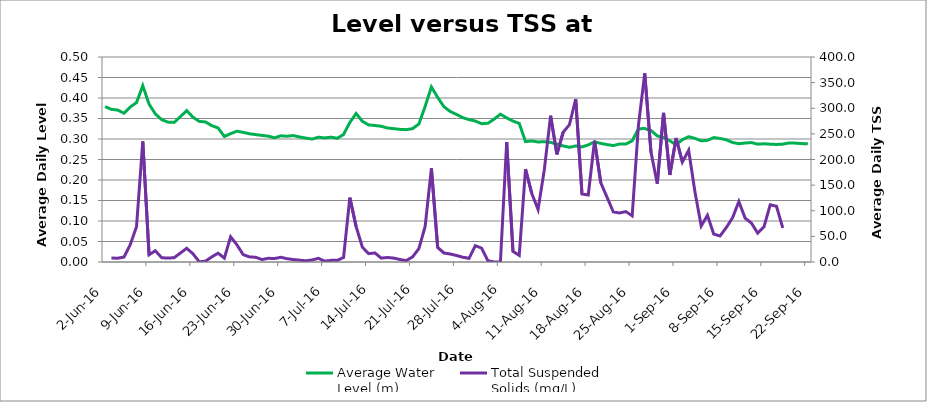
| Category | Average Water 
Level (m) |
|---|---|
| 2016-06-02 | 0.379 |
| 2016-06-03 | 0.372 |
| 2016-06-04 | 0.371 |
| 2016-06-05 | 0.363 |
| 2016-06-06 | 0.378 |
| 2016-06-07 | 0.389 |
| 2016-06-08 | 0.43 |
| 2016-06-09 | 0.385 |
| 2016-06-10 | 0.361 |
| 2016-06-11 | 0.347 |
| 2016-06-12 | 0.341 |
| 2016-06-13 | 0.34 |
| 2016-06-14 | 0.355 |
| 2016-06-15 | 0.369 |
| 2016-06-16 | 0.353 |
| 2016-06-17 | 0.343 |
| 2016-06-18 | 0.342 |
| 2016-06-19 | 0.333 |
| 2016-06-20 | 0.327 |
| 2016-06-21 | 0.306 |
| 2016-06-22 | 0.313 |
| 2016-06-23 | 0.319 |
| 2016-06-24 | 0.316 |
| 2016-06-25 | 0.313 |
| 2016-06-26 | 0.311 |
| 2016-06-27 | 0.309 |
| 2016-06-28 | 0.307 |
| 2016-06-29 | 0.303 |
| 2016-06-30 | 0.308 |
| 2016-07-01 | 0.307 |
| 2016-07-02 | 0.308 |
| 2016-07-03 | 0.305 |
| 2016-07-04 | 0.302 |
| 2016-07-05 | 0.3 |
| 2016-07-06 | 0.304 |
| 2016-07-07 | 0.303 |
| 2016-07-08 | 0.304 |
| 2016-07-09 | 0.302 |
| 2016-07-10 | 0.311 |
| 2016-07-11 | 0.34 |
| 2016-07-12 | 0.362 |
| 2016-07-13 | 0.343 |
| 2016-07-14 | 0.334 |
| 2016-07-15 | 0.333 |
| 2016-07-16 | 0.331 |
| 2016-07-17 | 0.327 |
| 2016-07-18 | 0.325 |
| 2016-07-19 | 0.323 |
| 2016-07-20 | 0.323 |
| 2016-07-21 | 0.325 |
| 2016-07-22 | 0.337 |
| 2016-07-23 | 0.379 |
| 2016-07-24 | 0.427 |
| 2016-07-25 | 0.401 |
| 2016-07-26 | 0.379 |
| 2016-07-27 | 0.367 |
| 2016-07-28 | 0.36 |
| 2016-07-29 | 0.352 |
| 2016-07-30 | 0.347 |
| 2016-07-31 | 0.344 |
| 2016-08-01 | 0.337 |
| 2016-08-02 | 0.338 |
| 2016-08-03 | 0.349 |
| 2016-08-04 | 0.361 |
| 2016-08-05 | 0.352 |
| 2016-08-06 | 0.344 |
| 2016-08-07 | 0.338 |
| 2016-08-08 | 0.294 |
| 2016-08-09 | 0.295 |
| 2016-08-10 | 0.293 |
| 2016-08-11 | 0.293 |
| 2016-08-12 | 0.292 |
| 2016-08-13 | 0.287 |
| 2016-08-14 | 0.283 |
| 2016-08-15 | 0.28 |
| 2016-08-16 | 0.283 |
| 2016-08-17 | 0.281 |
| 2016-08-18 | 0.286 |
| 2016-08-19 | 0.293 |
| 2016-08-20 | 0.289 |
| 2016-08-21 | 0.286 |
| 2016-08-22 | 0.284 |
| 2016-08-23 | 0.288 |
| 2016-08-24 | 0.288 |
| 2016-08-25 | 0.295 |
| 2016-08-26 | 0.325 |
| 2016-08-27 | 0.325 |
| 2016-08-28 | 0.321 |
| 2016-08-29 | 0.307 |
| 2016-08-30 | 0.304 |
| 2016-08-31 | 0.296 |
| 2016-09-01 | 0.286 |
| 2016-09-02 | 0.298 |
| 2016-09-03 | 0.306 |
| 2016-09-04 | 0.302 |
| 2016-09-05 | 0.296 |
| 2016-09-06 | 0.297 |
| 2016-09-07 | 0.304 |
| 2016-09-08 | 0.301 |
| 2016-09-09 | 0.298 |
| 2016-09-10 | 0.291 |
| 2016-09-11 | 0.289 |
| 2016-09-12 | 0.29 |
| 2016-09-13 | 0.291 |
| 2016-09-14 | 0.287 |
| 2016-09-15 | 0.288 |
| 2016-09-16 | 0.287 |
| 2016-09-17 | 0.287 |
| 2016-09-18 | 0.287 |
| 2016-09-19 | 0.29 |
| 2016-09-20 | 0.29 |
| 2016-09-21 | 0.289 |
| 2016-09-22 | 0.288 |